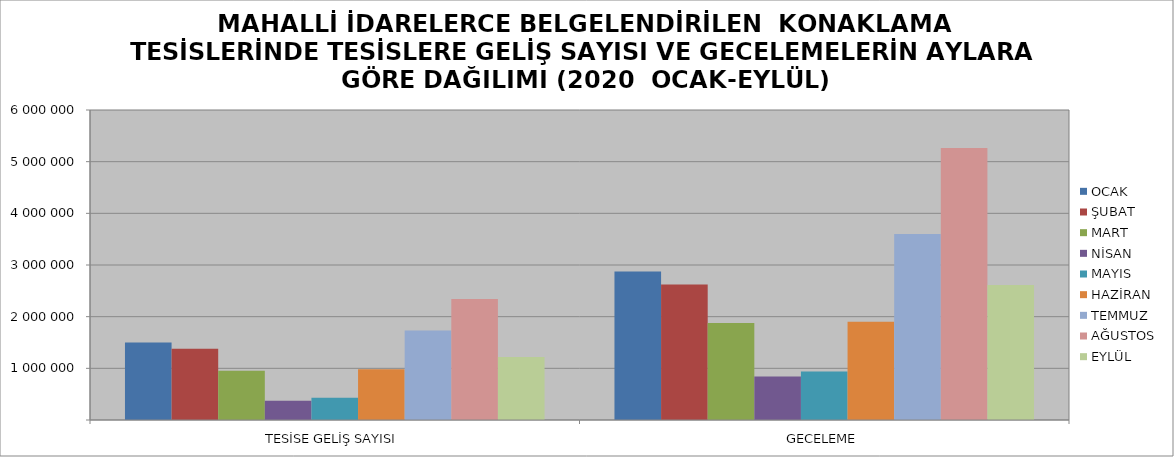
| Category | OCAK | ŞUBAT | MART | NİSAN | MAYIS | HAZİRAN | TEMMUZ | AĞUSTOS | EYLÜL |
|---|---|---|---|---|---|---|---|---|---|
| TESİSE GELİŞ SAYISI | 1497815 | 1380765 | 955554 | 372466 | 430328 | 981538 | 1730606 | 2342031 | 1217037 |
| GECELEME | 2872303 | 2621819 | 1878971 | 839735 | 939652 | 1902057 | 3601580 | 5263679 | 2612279 |